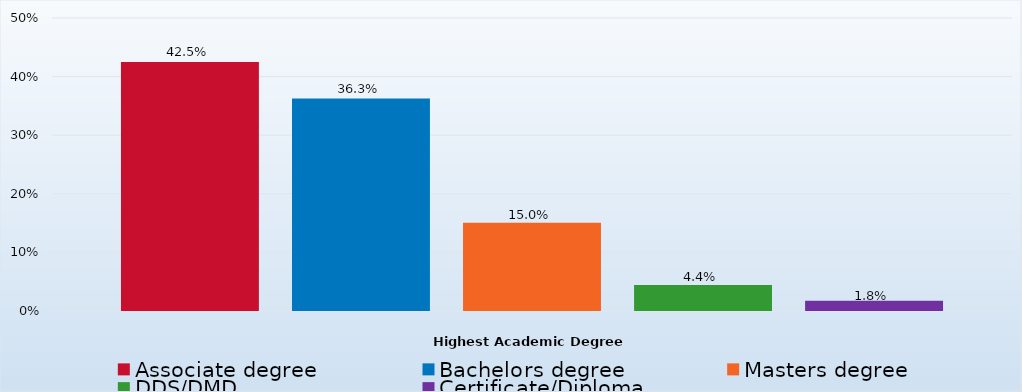
| Category | Associate degree | Bachelors degree | Masters degree | DDS/DMD | Certificate/Diploma |
|---|---|---|---|---|---|
| Percent | 0.425 | 0.363 | 0.15 | 0.044 | 0.018 |